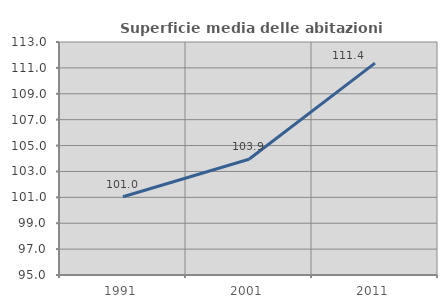
| Category | Superficie media delle abitazioni occupate |
|---|---|
| 1991.0 | 101.041 |
| 2001.0 | 103.946 |
| 2011.0 | 111.368 |